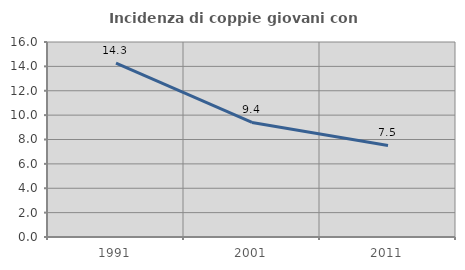
| Category | Incidenza di coppie giovani con figli |
|---|---|
| 1991.0 | 14.271 |
| 2001.0 | 9.399 |
| 2011.0 | 7.513 |